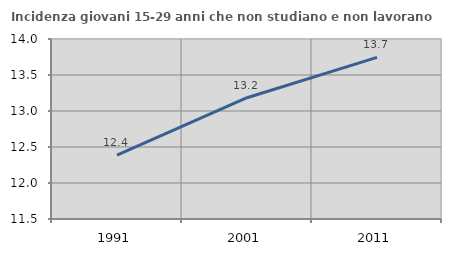
| Category | Incidenza giovani 15-29 anni che non studiano e non lavorano  |
|---|---|
| 1991.0 | 12.388 |
| 2001.0 | 13.184 |
| 2011.0 | 13.746 |